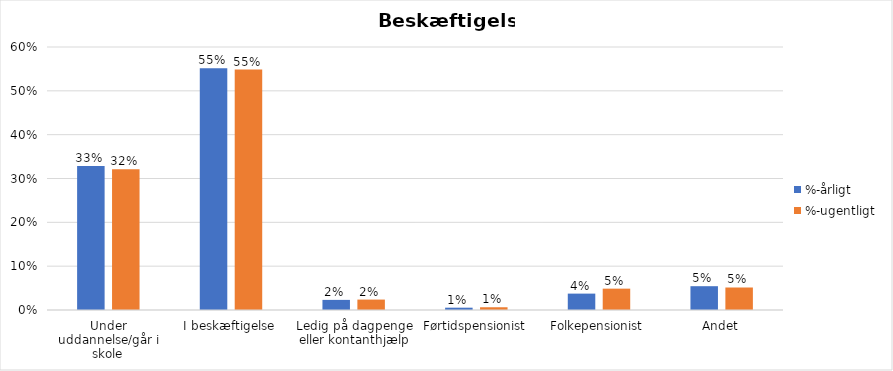
| Category | %-årligt | %-ugentligt |
|---|---|---|
| Under uddannelse/går i skole | 0.329 | 0.321 |
| I beskæftigelse | 0.551 | 0.549 |
| Ledig på dagpenge eller kontanthjælp | 0.023 | 0.024 |
| Førtidspensionist | 0.005 | 0.006 |
| Folkepensionist | 0.037 | 0.049 |
| Andet | 0.054 | 0.051 |